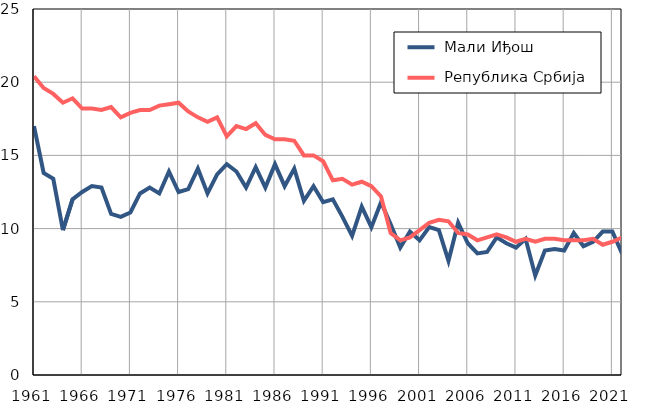
| Category |  Мали Иђош |  Република Србија |
|---|---|---|
| 1961.0 | 17 | 20.4 |
| 1962.0 | 13.8 | 19.6 |
| 1963.0 | 13.4 | 19.2 |
| 1964.0 | 9.9 | 18.6 |
| 1965.0 | 12 | 18.9 |
| 1966.0 | 12.5 | 18.2 |
| 1967.0 | 12.9 | 18.2 |
| 1968.0 | 12.8 | 18.1 |
| 1969.0 | 11 | 18.3 |
| 1970.0 | 10.8 | 17.6 |
| 1971.0 | 11.1 | 17.9 |
| 1972.0 | 12.4 | 18.1 |
| 1973.0 | 12.8 | 18.1 |
| 1974.0 | 12.4 | 18.4 |
| 1975.0 | 13.9 | 18.5 |
| 1976.0 | 12.5 | 18.6 |
| 1977.0 | 12.7 | 18 |
| 1978.0 | 14.1 | 17.6 |
| 1979.0 | 12.4 | 17.3 |
| 1980.0 | 13.7 | 17.6 |
| 1981.0 | 14.4 | 16.3 |
| 1982.0 | 13.9 | 17 |
| 1983.0 | 12.8 | 16.8 |
| 1984.0 | 14.2 | 17.2 |
| 1985.0 | 12.8 | 16.4 |
| 1986.0 | 14.4 | 16.1 |
| 1987.0 | 12.9 | 16.1 |
| 1988.0 | 14.1 | 16 |
| 1989.0 | 11.9 | 15 |
| 1990.0 | 12.9 | 15 |
| 1991.0 | 11.8 | 14.6 |
| 1992.0 | 12 | 13.3 |
| 1993.0 | 10.8 | 13.4 |
| 1994.0 | 9.5 | 13 |
| 1995.0 | 11.5 | 13.2 |
| 1996.0 | 10.1 | 12.9 |
| 1997.0 | 11.8 | 12.2 |
| 1998.0 | 10.3 | 9.7 |
| 1999.0 | 8.7 | 9.2 |
| 2000.0 | 9.8 | 9.4 |
| 2001.0 | 9.2 | 9.9 |
| 2002.0 | 10.1 | 10.4 |
| 2003.0 | 9.9 | 10.6 |
| 2004.0 | 7.8 | 10.5 |
| 2005.0 | 10.4 | 9.7 |
| 2006.0 | 9 | 9.6 |
| 2007.0 | 8.3 | 9.2 |
| 2008.0 | 8.4 | 9.4 |
| 2009.0 | 9.4 | 9.6 |
| 2010.0 | 9 | 9.4 |
| 2011.0 | 8.7 | 9.1 |
| 2012.0 | 9.3 | 9.3 |
| 2013.0 | 6.8 | 9.1 |
| 2014.0 | 8.5 | 9.3 |
| 2015.0 | 8.6 | 9.3 |
| 2016.0 | 8.5 | 9.2 |
| 2017.0 | 9.7 | 9.2 |
| 2018.0 | 8.8 | 9.2 |
| 2019.0 | 9.1 | 9.3 |
| 2020.0 | 9.8 | 8.9 |
| 2021.0 | 9.8 | 9.1 |
| 2022.0 | 8.3 | 9.4 |